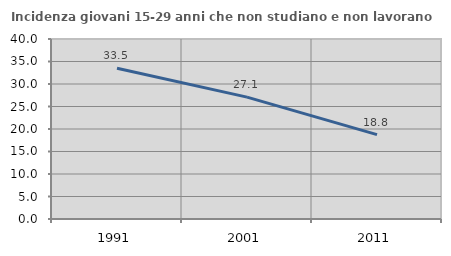
| Category | Incidenza giovani 15-29 anni che non studiano e non lavorano  |
|---|---|
| 1991.0 | 33.491 |
| 2001.0 | 27.083 |
| 2011.0 | 18.75 |